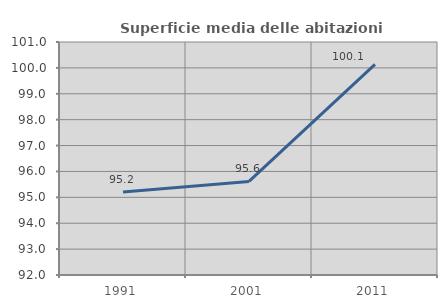
| Category | Superficie media delle abitazioni occupate |
|---|---|
| 1991.0 | 95.204 |
| 2001.0 | 95.616 |
| 2011.0 | 100.132 |